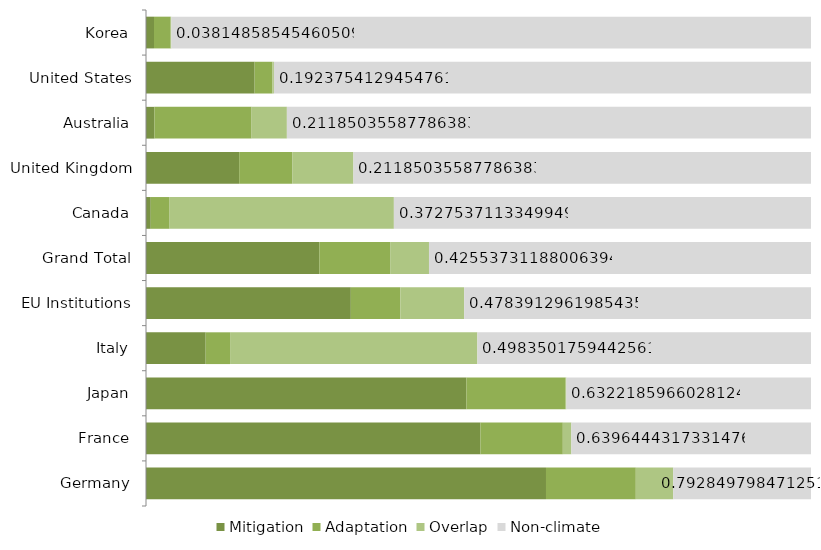
| Category | Mitigation | Adaptation | Overlap | Non-climate |
|---|---|---|---|---|
| Germany | 0.601 | 0.135 | 0.056 | 0.207 |
| France | 0.503 | 0.124 | 0.013 | 0.36 |
| Japan | 0.482 | 0.149 | 0.001 | 0.368 |
| Italy | 0.09 | 0.037 | 0.372 | 0.502 |
| EU Institutions | 0.308 | 0.075 | 0.096 | 0.522 |
| Grand Total | 0.261 | 0.107 | 0.058 | 0.574 |
| Canada | 0.007 | 0.028 | 0.337 | 0.627 |
| United Kingdom | 0.14 | 0.08 | 0.092 | 0.688 |
| Australia | 0.013 | 0.146 | 0.053 | 0.788 |
| United States | 0.163 | 0.027 | 0.002 | 0.808 |
| Korea | 0.012 | 0.025 | 0.001 | 0.962 |